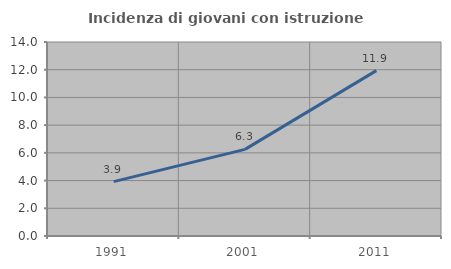
| Category | Incidenza di giovani con istruzione universitaria |
|---|---|
| 1991.0 | 3.926 |
| 2001.0 | 6.25 |
| 2011.0 | 11.932 |